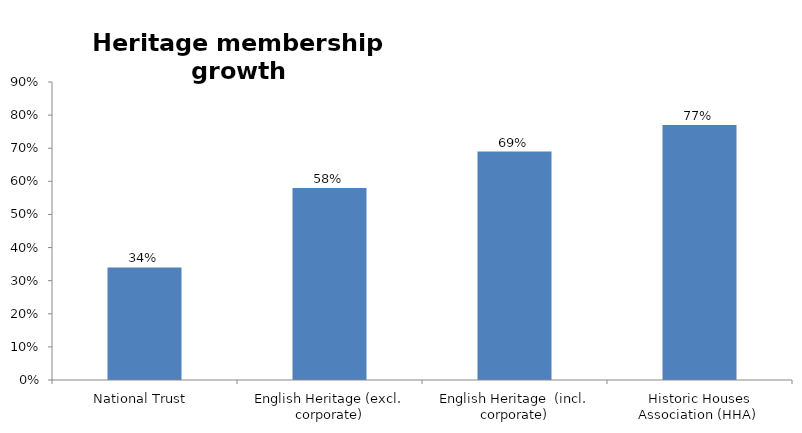
| Category | Series 0 |
|---|---|
| National Trust  | 0.34 |
| English Heritage (excl. corporate) | 0.58 |
| English Heritage  (incl. corporate) | 0.69 |
| Historic Houses Association (HHA)  | 0.77 |